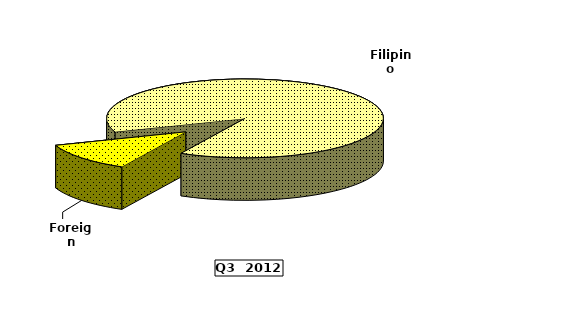
| Category | Series 0 |
|---|---|
| Filipino | 132.609 |
| Foreign | 17.734 |